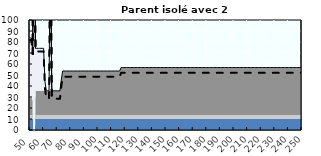
| Category | Coin fiscal marginal (somme des composantes) | Taux d’imposition marginal net |
|---|---|---|
| 50.0 | 83.627 | 81.817 |
| 51.0 | 83.627 | 81.817 |
| 52.0 | 72.213 | 69.143 |
| 53.0 | 312.677 | 336.178 |
| 54.0 | 74.246 | 71.4 |
| 55.0 | 74.246 | 71.4 |
| 56.0 | 74.246 | 71.4 |
| 57.0 | 74.246 | 71.4 |
| 58.0 | 74.246 | 71.4 |
| 59.0 | 74.246 | 71.4 |
| 60.0 | 74.246 | 71.4 |
| 61.0 | 43.951 | 37.758 |
| 62.0 | 35.615 | 28.5 |
| 63.0 | 35.615 | 28.5 |
| 64.0 | 35.615 | 28.5 |
| 65.0 | 191.963 | 202.125 |
| 66.0 | 35.615 | 28.5 |
| 67.0 | 35.615 | 28.5 |
| 68.0 | 35.615 | 28.5 |
| 69.0 | 35.615 | 28.5 |
| 70.0 | 35.615 | 28.5 |
| 71.0 | 35.615 | 28.5 |
| 72.0 | 35.615 | 28.5 |
| 73.0 | 45.4 | 39.367 |
| 74.0 | 53.624 | 48.5 |
| 75.0 | 53.624 | 48.5 |
| 76.0 | 53.624 | 48.5 |
| 77.0 | 53.624 | 48.5 |
| 78.0 | 53.624 | 48.5 |
| 79.0 | 53.624 | 48.5 |
| 80.0 | 53.624 | 48.5 |
| 81.0 | 53.624 | 48.5 |
| 82.0 | 53.624 | 48.5 |
| 83.0 | 53.624 | 48.5 |
| 84.0 | 53.624 | 48.5 |
| 85.0 | 53.624 | 48.5 |
| 86.0 | 53.624 | 48.5 |
| 87.0 | 53.624 | 48.5 |
| 88.0 | 53.624 | 48.5 |
| 89.0 | 53.624 | 48.5 |
| 90.0 | 53.624 | 48.5 |
| 91.0 | 53.624 | 48.5 |
| 92.0 | 53.624 | 48.5 |
| 93.0 | 53.624 | 48.5 |
| 94.0 | 53.624 | 48.5 |
| 95.0 | 53.624 | 48.5 |
| 96.0 | 53.624 | 48.5 |
| 97.0 | 53.624 | 48.5 |
| 98.0 | 53.624 | 48.5 |
| 99.0 | 53.624 | 48.5 |
| 100.0 | 53.624 | 48.5 |
| 101.0 | 53.624 | 48.5 |
| 102.0 | 53.624 | 48.5 |
| 103.0 | 53.624 | 48.5 |
| 104.0 | 53.624 | 48.5 |
| 105.0 | 53.624 | 48.5 |
| 106.0 | 53.624 | 48.5 |
| 107.0 | 53.624 | 48.5 |
| 108.0 | 53.624 | 48.5 |
| 109.0 | 53.624 | 48.5 |
| 110.0 | 53.624 | 48.5 |
| 111.0 | 53.624 | 48.5 |
| 112.0 | 53.624 | 48.5 |
| 113.0 | 53.624 | 48.5 |
| 114.0 | 53.624 | 48.5 |
| 115.0 | 53.624 | 48.5 |
| 116.0 | 53.825 | 48.723 |
| 117.0 | 56.776 | 52 |
| 118.0 | 56.776 | 52 |
| 119.0 | 56.776 | 52 |
| 120.0 | 56.776 | 52 |
| 121.0 | 56.776 | 52 |
| 122.0 | 56.776 | 52 |
| 123.0 | 56.776 | 52 |
| 124.0 | 56.776 | 52 |
| 125.0 | 56.776 | 52 |
| 126.0 | 56.776 | 52 |
| 127.0 | 56.776 | 52 |
| 128.0 | 56.776 | 52 |
| 129.0 | 56.776 | 52 |
| 130.0 | 56.776 | 52 |
| 131.0 | 56.776 | 52 |
| 132.0 | 56.776 | 52 |
| 133.0 | 56.776 | 52 |
| 134.0 | 56.776 | 52 |
| 135.0 | 56.776 | 52 |
| 136.0 | 56.776 | 52 |
| 137.0 | 56.776 | 52 |
| 138.0 | 56.776 | 52 |
| 139.0 | 56.776 | 52 |
| 140.0 | 56.776 | 52 |
| 141.0 | 56.776 | 52 |
| 142.0 | 56.776 | 52 |
| 143.0 | 56.776 | 52 |
| 144.0 | 56.776 | 52 |
| 145.0 | 56.776 | 52 |
| 146.0 | 56.776 | 52 |
| 147.0 | 56.776 | 52 |
| 148.0 | 56.776 | 52 |
| 149.0 | 56.776 | 52 |
| 150.0 | 56.776 | 52 |
| 151.0 | 56.776 | 52 |
| 152.0 | 56.776 | 52 |
| 153.0 | 56.776 | 52 |
| 154.0 | 56.776 | 52 |
| 155.0 | 56.776 | 52 |
| 156.0 | 56.776 | 52 |
| 157.0 | 56.776 | 52 |
| 158.0 | 56.776 | 52 |
| 159.0 | 56.776 | 52 |
| 160.0 | 56.776 | 52 |
| 161.0 | 56.776 | 52 |
| 162.0 | 56.776 | 52 |
| 163.0 | 56.776 | 52 |
| 164.0 | 56.776 | 52 |
| 165.0 | 56.776 | 52 |
| 166.0 | 56.776 | 52 |
| 167.0 | 56.776 | 52 |
| 168.0 | 56.776 | 52 |
| 169.0 | 56.776 | 52 |
| 170.0 | 56.776 | 52 |
| 171.0 | 56.776 | 52 |
| 172.0 | 56.776 | 52 |
| 173.0 | 56.776 | 52 |
| 174.0 | 56.776 | 52 |
| 175.0 | 56.776 | 52 |
| 176.0 | 56.776 | 52 |
| 177.0 | 56.776 | 52 |
| 178.0 | 56.776 | 52 |
| 179.0 | 56.776 | 52 |
| 180.0 | 56.776 | 52 |
| 181.0 | 56.776 | 52 |
| 182.0 | 56.776 | 52 |
| 183.0 | 56.776 | 52 |
| 184.0 | 56.776 | 52 |
| 185.0 | 56.776 | 52 |
| 186.0 | 56.776 | 52 |
| 187.0 | 56.776 | 52 |
| 188.0 | 56.776 | 52 |
| 189.0 | 56.776 | 52 |
| 190.0 | 56.776 | 52 |
| 191.0 | 56.776 | 52 |
| 192.0 | 56.776 | 52 |
| 193.0 | 56.776 | 52 |
| 194.0 | 56.776 | 52 |
| 195.0 | 56.776 | 52 |
| 196.0 | 56.776 | 52 |
| 197.0 | 56.776 | 52 |
| 198.0 | 56.776 | 52 |
| 199.0 | 56.776 | 52 |
| 200.0 | 56.776 | 52 |
| 201.0 | 56.776 | 52 |
| 202.0 | 56.776 | 52 |
| 203.0 | 56.776 | 52 |
| 204.0 | 56.776 | 52 |
| 205.0 | 56.776 | 52 |
| 206.0 | 56.776 | 52 |
| 207.0 | 56.776 | 52 |
| 208.0 | 56.776 | 52 |
| 209.0 | 56.776 | 52 |
| 210.0 | 56.776 | 52 |
| 211.0 | 56.776 | 52 |
| 212.0 | 56.776 | 52 |
| 213.0 | 56.776 | 52 |
| 214.0 | 56.776 | 52 |
| 215.0 | 56.776 | 52 |
| 216.0 | 56.776 | 52 |
| 217.0 | 56.776 | 52 |
| 218.0 | 56.776 | 52 |
| 219.0 | 56.776 | 52 |
| 220.0 | 56.776 | 52 |
| 221.0 | 56.776 | 52 |
| 222.0 | 56.776 | 52 |
| 223.0 | 56.776 | 52 |
| 224.0 | 56.776 | 52 |
| 225.0 | 56.776 | 52 |
| 226.0 | 56.776 | 52 |
| 227.0 | 56.776 | 52 |
| 228.0 | 56.776 | 52 |
| 229.0 | 56.776 | 52 |
| 230.0 | 56.776 | 52 |
| 231.0 | 56.776 | 52 |
| 232.0 | 56.776 | 52 |
| 233.0 | 56.776 | 52 |
| 234.0 | 56.776 | 52 |
| 235.0 | 56.776 | 52 |
| 236.0 | 56.776 | 52 |
| 237.0 | 56.776 | 52 |
| 238.0 | 56.776 | 52 |
| 239.0 | 56.776 | 52 |
| 240.0 | 56.776 | 52 |
| 241.0 | 56.776 | 52 |
| 242.0 | 56.776 | 52 |
| 243.0 | 56.776 | 52 |
| 244.0 | 56.776 | 52 |
| 245.0 | 56.776 | 52 |
| 246.0 | 56.776 | 52 |
| 247.0 | 56.776 | 52 |
| 248.0 | 56.776 | 52 |
| 249.0 | 56.776 | 52 |
| 250.0 | 56.776 | 52 |